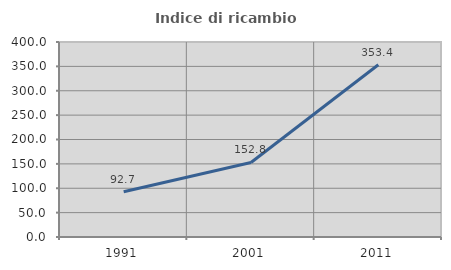
| Category | Indice di ricambio occupazionale  |
|---|---|
| 1991.0 | 92.669 |
| 2001.0 | 152.846 |
| 2011.0 | 353.435 |